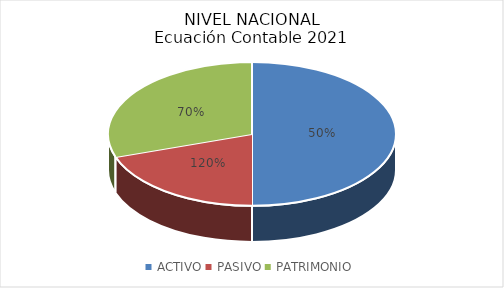
| Category | Series 0 |
|---|---|
| ACTIVO | 732860198586.119 |
| PASIVO | 1756073100018.855 |
| PATRIMONIO | -1023212901432.74 |